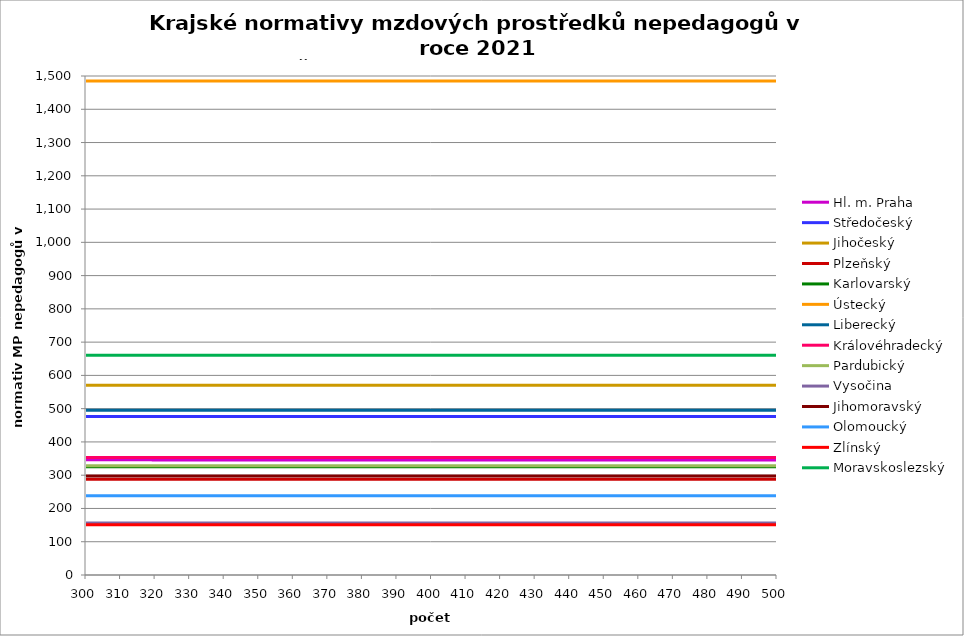
| Category | Hl. m. Praha | Středočeský | Jihočeský | Plzeňský | Karlovarský  | Ústecký   | Liberecký | Královéhradecký | Pardubický | Vysočina | Jihomoravský | Olomoucký | Zlínský | Moravskoslezský |
|---|---|---|---|---|---|---|---|---|---|---|---|---|---|---|
| 300.0 | 346.09 | 476.411 | 570.336 | 287.547 | 325.5 | 1485.12 | 495 | 353.474 | 328.432 | 156.391 | 297.28 | 238.483 | 151.2 | 660.577 |
| 301.0 | 346.09 | 476.411 | 570.336 | 287.547 | 325.5 | 1485.12 | 495 | 353.474 | 328.432 | 156.391 | 297.28 | 238.483 | 151.2 | 660.577 |
| 302.0 | 346.09 | 476.411 | 570.336 | 287.547 | 325.5 | 1485.12 | 495 | 353.474 | 328.432 | 156.391 | 297.28 | 238.483 | 151.2 | 660.577 |
| 303.0 | 346.09 | 476.411 | 570.336 | 287.547 | 325.5 | 1485.12 | 495 | 353.474 | 328.432 | 156.391 | 297.28 | 238.483 | 151.2 | 660.577 |
| 304.0 | 346.085 | 476.411 | 570.336 | 287.547 | 325.5 | 1485.12 | 495 | 353.474 | 328.432 | 156.391 | 297.28 | 238.483 | 151.2 | 660.577 |
| 305.0 | 346.085 | 476.411 | 570.336 | 287.547 | 325.5 | 1485.12 | 495 | 353.474 | 328.432 | 156.391 | 297.28 | 238.483 | 151.2 | 660.577 |
| 306.0 | 346.085 | 476.411 | 570.336 | 287.547 | 325.5 | 1485.12 | 495 | 353.474 | 328.432 | 156.391 | 297.28 | 238.483 | 151.2 | 660.577 |
| 307.0 | 346.085 | 476.411 | 570.336 | 287.547 | 325.5 | 1485.12 | 495 | 353.474 | 328.432 | 156.391 | 297.28 | 238.483 | 151.2 | 660.577 |
| 308.0 | 346.081 | 476.411 | 570.336 | 287.547 | 325.5 | 1485.12 | 495 | 353.474 | 328.432 | 156.391 | 297.28 | 238.483 | 151.2 | 660.577 |
| 309.0 | 346.081 | 476.411 | 570.336 | 287.547 | 325.5 | 1485.12 | 495 | 353.474 | 328.432 | 156.391 | 297.28 | 238.483 | 151.2 | 660.577 |
| 310.0 | 346.081 | 476.411 | 570.336 | 287.547 | 325.5 | 1485.12 | 495 | 353.474 | 328.432 | 156.391 | 297.28 | 238.483 | 151.2 | 660.577 |
| 311.0 | 346.076 | 476.411 | 570.336 | 287.547 | 325.5 | 1485.12 | 495 | 353.474 | 328.432 | 156.391 | 297.28 | 238.483 | 151.2 | 660.577 |
| 312.0 | 346.076 | 476.411 | 570.336 | 287.547 | 325.5 | 1485.12 | 495 | 353.474 | 328.432 | 156.391 | 297.28 | 238.483 | 151.2 | 660.577 |
| 313.0 | 346.076 | 476.411 | 570.336 | 287.547 | 325.5 | 1485.12 | 495 | 353.474 | 328.432 | 156.391 | 297.28 | 238.483 | 151.2 | 660.577 |
| 314.0 | 346.076 | 476.411 | 570.336 | 287.547 | 325.5 | 1485.12 | 495 | 353.474 | 328.432 | 156.391 | 297.28 | 238.483 | 151.2 | 660.577 |
| 315.0 | 346.071 | 476.411 | 570.336 | 287.547 | 325.5 | 1485.12 | 495 | 353.474 | 328.432 | 156.391 | 297.28 | 238.483 | 151.2 | 660.577 |
| 316.0 | 346.071 | 476.411 | 570.336 | 287.547 | 325.5 | 1485.12 | 495 | 353.474 | 328.432 | 156.391 | 297.28 | 238.483 | 151.2 | 660.577 |
| 317.0 | 346.071 | 476.411 | 570.336 | 287.547 | 325.5 | 1485.12 | 495 | 353.474 | 328.432 | 156.391 | 297.28 | 238.483 | 151.2 | 660.577 |
| 318.0 | 346.071 | 476.411 | 570.336 | 287.547 | 325.5 | 1485.12 | 495 | 353.474 | 328.432 | 156.391 | 297.28 | 238.483 | 151.2 | 660.577 |
| 319.0 | 346.066 | 476.411 | 570.336 | 287.547 | 325.5 | 1485.12 | 495 | 353.474 | 328.432 | 156.391 | 297.28 | 238.483 | 151.2 | 660.577 |
| 320.0 | 346.066 | 476.411 | 570.336 | 287.547 | 325.5 | 1485.12 | 495 | 353.474 | 328.432 | 156.391 | 297.28 | 238.483 | 151.2 | 660.577 |
| 321.0 | 346.066 | 476.411 | 570.336 | 287.547 | 325.5 | 1485.12 | 495 | 353.474 | 328.432 | 156.391 | 297.28 | 238.483 | 151.2 | 660.577 |
| 322.0 | 346.066 | 476.411 | 570.336 | 287.547 | 325.5 | 1485.12 | 495 | 353.474 | 328.432 | 156.391 | 297.28 | 238.483 | 151.2 | 660.577 |
| 323.0 | 346.061 | 476.411 | 570.336 | 287.547 | 325.5 | 1485.12 | 495 | 353.474 | 328.432 | 156.391 | 297.28 | 238.483 | 151.2 | 660.577 |
| 324.0 | 346.061 | 476.411 | 570.336 | 287.547 | 325.5 | 1485.12 | 495 | 353.474 | 328.432 | 156.391 | 297.28 | 238.483 | 151.2 | 660.577 |
| 325.0 | 346.061 | 476.411 | 570.336 | 287.547 | 325.5 | 1485.12 | 495 | 353.474 | 328.432 | 156.391 | 297.28 | 238.483 | 151.2 | 660.577 |
| 326.0 | 346.061 | 476.411 | 570.336 | 287.547 | 325.5 | 1485.12 | 495 | 353.474 | 328.432 | 156.391 | 297.28 | 238.483 | 151.2 | 660.577 |
| 327.0 | 346.056 | 476.411 | 570.336 | 287.547 | 325.5 | 1485.12 | 495 | 353.474 | 328.432 | 156.391 | 297.28 | 238.483 | 151.2 | 660.577 |
| 328.0 | 346.056 | 476.411 | 570.336 | 287.547 | 325.5 | 1485.12 | 495 | 353.474 | 328.432 | 156.391 | 297.28 | 238.483 | 151.2 | 660.577 |
| 329.0 | 346.056 | 476.411 | 570.336 | 287.547 | 325.5 | 1485.12 | 495 | 353.474 | 328.432 | 156.391 | 297.28 | 238.483 | 151.2 | 660.577 |
| 330.0 | 346.056 | 476.411 | 570.336 | 287.547 | 325.5 | 1485.12 | 495 | 353.474 | 328.432 | 156.391 | 297.28 | 238.483 | 151.2 | 660.577 |
| 331.0 | 346.051 | 476.411 | 570.336 | 287.547 | 325.5 | 1485.12 | 495 | 353.474 | 328.432 | 156.391 | 297.28 | 238.483 | 151.2 | 660.577 |
| 332.0 | 346.051 | 476.411 | 570.336 | 287.547 | 325.5 | 1485.12 | 495 | 353.474 | 328.432 | 156.391 | 297.28 | 238.483 | 151.2 | 660.577 |
| 333.0 | 346.051 | 476.411 | 570.336 | 287.547 | 325.5 | 1485.12 | 495 | 353.474 | 328.432 | 156.391 | 297.28 | 238.483 | 151.2 | 660.577 |
| 334.0 | 346.051 | 476.411 | 570.336 | 287.547 | 325.5 | 1485.12 | 495 | 353.474 | 328.432 | 156.391 | 297.28 | 238.483 | 151.2 | 660.577 |
| 335.0 | 346.046 | 476.411 | 570.336 | 287.547 | 325.5 | 1485.12 | 495 | 353.474 | 328.432 | 156.391 | 297.28 | 238.483 | 151.2 | 660.577 |
| 336.0 | 346.046 | 476.411 | 570.336 | 287.547 | 325.5 | 1485.12 | 495 | 353.474 | 328.432 | 156.391 | 297.28 | 238.483 | 151.2 | 660.577 |
| 337.0 | 346.046 | 476.411 | 570.336 | 287.547 | 325.5 | 1485.12 | 495 | 353.474 | 328.432 | 156.391 | 297.28 | 238.483 | 151.2 | 660.577 |
| 338.0 | 346.046 | 476.411 | 570.336 | 287.547 | 325.5 | 1485.12 | 495 | 353.474 | 328.432 | 156.391 | 297.28 | 238.483 | 151.2 | 660.577 |
| 339.0 | 346.041 | 476.411 | 570.336 | 287.547 | 325.5 | 1485.12 | 495 | 353.474 | 328.432 | 156.391 | 297.28 | 238.483 | 151.2 | 660.577 |
| 340.0 | 346.041 | 476.411 | 570.336 | 287.547 | 325.5 | 1485.12 | 495 | 353.474 | 328.432 | 156.391 | 297.28 | 238.483 | 151.2 | 660.577 |
| 341.0 | 346.041 | 476.411 | 570.336 | 287.547 | 325.5 | 1485.12 | 495 | 353.474 | 328.432 | 156.391 | 297.28 | 238.483 | 151.2 | 660.577 |
| 342.0 | 346.041 | 476.411 | 570.336 | 287.547 | 325.5 | 1485.12 | 495 | 353.474 | 328.432 | 156.391 | 297.28 | 238.483 | 151.2 | 660.577 |
| 343.0 | 346.037 | 476.411 | 570.336 | 287.547 | 325.5 | 1485.12 | 495 | 353.474 | 328.432 | 156.391 | 297.28 | 238.483 | 151.2 | 660.577 |
| 344.0 | 346.037 | 476.411 | 570.336 | 287.547 | 325.5 | 1485.12 | 495 | 353.474 | 328.432 | 156.391 | 297.28 | 238.483 | 151.2 | 660.577 |
| 345.0 | 346.037 | 476.411 | 570.336 | 287.547 | 325.5 | 1485.12 | 495 | 353.474 | 328.432 | 156.391 | 297.28 | 238.483 | 151.2 | 660.577 |
| 346.0 | 346.037 | 476.411 | 570.336 | 287.547 | 325.5 | 1485.12 | 495 | 353.474 | 328.432 | 156.391 | 297.28 | 238.483 | 151.2 | 660.577 |
| 347.0 | 346.032 | 476.411 | 570.336 | 287.547 | 325.5 | 1485.12 | 495 | 353.474 | 328.432 | 156.391 | 297.28 | 238.483 | 151.2 | 660.577 |
| 348.0 | 346.032 | 476.411 | 570.336 | 287.547 | 325.5 | 1485.12 | 495 | 353.474 | 328.432 | 156.391 | 297.28 | 238.483 | 151.2 | 660.577 |
| 349.0 | 346.032 | 476.411 | 570.336 | 287.547 | 325.5 | 1485.12 | 495 | 353.474 | 328.432 | 156.391 | 297.28 | 238.483 | 151.2 | 660.577 |
| 350.0 | 346.032 | 476.411 | 570.336 | 287.547 | 325.5 | 1485.12 | 495 | 353.474 | 328.432 | 156.391 | 297.28 | 238.483 | 151.2 | 660.577 |
| 351.0 | 346.027 | 476.411 | 570.336 | 287.547 | 325.5 | 1485.12 | 495 | 353.474 | 328.432 | 156.391 | 297.28 | 238.483 | 151.2 | 660.577 |
| 352.0 | 346.027 | 476.411 | 570.336 | 287.547 | 325.5 | 1485.12 | 495 | 353.474 | 328.432 | 156.391 | 297.28 | 238.483 | 151.2 | 660.577 |
| 353.0 | 346.027 | 476.411 | 570.336 | 287.547 | 325.5 | 1485.12 | 495 | 353.474 | 328.432 | 156.391 | 297.28 | 238.483 | 151.2 | 660.577 |
| 354.0 | 346.027 | 476.411 | 570.336 | 287.547 | 325.5 | 1485.12 | 495 | 353.474 | 328.432 | 156.391 | 297.28 | 238.483 | 151.2 | 660.577 |
| 355.0 | 346.027 | 476.411 | 570.336 | 287.547 | 325.5 | 1485.12 | 495 | 353.474 | 328.432 | 156.391 | 297.28 | 238.483 | 151.2 | 660.577 |
| 356.0 | 346.022 | 476.411 | 570.336 | 287.547 | 325.5 | 1485.12 | 495 | 353.474 | 328.432 | 156.391 | 297.28 | 238.483 | 151.2 | 660.577 |
| 357.0 | 346.022 | 476.411 | 570.336 | 287.547 | 325.5 | 1485.12 | 495 | 353.474 | 328.432 | 156.391 | 297.28 | 238.483 | 151.2 | 660.577 |
| 358.0 | 346.022 | 476.411 | 570.336 | 287.547 | 325.5 | 1485.12 | 495 | 353.474 | 328.432 | 156.391 | 297.28 | 238.483 | 151.2 | 660.577 |
| 359.0 | 346.022 | 476.411 | 570.336 | 287.547 | 325.5 | 1485.12 | 495 | 353.474 | 328.432 | 156.391 | 297.28 | 238.483 | 151.2 | 660.577 |
| 360.0 | 346.017 | 476.411 | 570.336 | 287.547 | 325.5 | 1485.12 | 495 | 353.474 | 328.432 | 156.391 | 297.28 | 238.483 | 151.2 | 660.577 |
| 361.0 | 346.017 | 476.411 | 570.336 | 287.547 | 325.5 | 1485.12 | 495 | 353.474 | 328.432 | 156.391 | 297.28 | 238.483 | 151.2 | 660.577 |
| 362.0 | 346.017 | 476.411 | 570.336 | 287.547 | 325.5 | 1485.12 | 495 | 353.474 | 328.432 | 156.391 | 297.28 | 238.483 | 151.2 | 660.577 |
| 363.0 | 346.017 | 476.411 | 570.336 | 287.547 | 325.5 | 1485.12 | 495 | 353.474 | 328.432 | 156.391 | 297.28 | 238.483 | 151.2 | 660.577 |
| 364.0 | 346.012 | 476.411 | 570.336 | 287.547 | 325.5 | 1485.12 | 495 | 353.474 | 328.432 | 156.391 | 297.28 | 238.483 | 151.2 | 660.577 |
| 365.0 | 346.012 | 476.411 | 570.336 | 287.547 | 325.5 | 1485.12 | 495 | 353.474 | 328.432 | 156.391 | 297.28 | 238.483 | 151.2 | 660.577 |
| 366.0 | 346.012 | 476.411 | 570.336 | 287.547 | 325.5 | 1485.12 | 495 | 353.474 | 328.432 | 156.391 | 297.28 | 238.483 | 151.2 | 660.577 |
| 367.0 | 346.012 | 476.411 | 570.336 | 287.547 | 325.5 | 1485.12 | 495 | 353.474 | 328.432 | 156.391 | 297.28 | 238.483 | 151.2 | 660.577 |
| 368.0 | 346.012 | 476.411 | 570.336 | 287.547 | 325.5 | 1485.12 | 495 | 353.474 | 328.432 | 156.391 | 297.28 | 238.483 | 151.2 | 660.577 |
| 369.0 | 346.007 | 476.411 | 570.336 | 287.547 | 325.5 | 1485.12 | 495 | 353.474 | 328.432 | 156.391 | 297.28 | 238.483 | 151.2 | 660.577 |
| 370.0 | 346.007 | 476.411 | 570.336 | 287.547 | 325.5 | 1485.12 | 495 | 353.474 | 328.432 | 156.391 | 297.28 | 238.483 | 151.2 | 660.577 |
| 371.0 | 346.007 | 476.411 | 570.336 | 287.547 | 325.5 | 1485.12 | 495 | 353.474 | 328.432 | 156.391 | 297.28 | 238.483 | 151.2 | 660.577 |
| 372.0 | 346.007 | 476.411 | 570.336 | 287.547 | 325.5 | 1485.12 | 495 | 353.474 | 328.432 | 156.391 | 297.28 | 238.483 | 151.2 | 660.577 |
| 373.0 | 346.002 | 476.411 | 570.336 | 287.547 | 325.5 | 1485.12 | 495 | 353.474 | 328.432 | 156.391 | 297.28 | 238.483 | 151.2 | 660.577 |
| 374.0 | 346.002 | 476.411 | 570.336 | 287.547 | 325.5 | 1485.12 | 495 | 353.474 | 328.432 | 156.391 | 297.28 | 238.483 | 151.2 | 660.577 |
| 375.0 | 346.002 | 476.411 | 570.336 | 287.547 | 325.5 | 1485.12 | 495 | 353.474 | 328.432 | 156.391 | 297.28 | 238.483 | 151.2 | 660.577 |
| 376.0 | 346.002 | 476.411 | 570.336 | 287.547 | 325.5 | 1485.12 | 495 | 353.474 | 328.432 | 156.391 | 297.28 | 238.483 | 151.2 | 660.577 |
| 377.0 | 346.002 | 476.411 | 570.336 | 287.547 | 325.5 | 1485.12 | 495 | 353.474 | 328.432 | 156.391 | 297.28 | 238.483 | 151.2 | 660.577 |
| 378.0 | 345.998 | 476.411 | 570.336 | 287.547 | 325.5 | 1485.12 | 495 | 353.474 | 328.432 | 156.391 | 297.28 | 238.483 | 151.2 | 660.577 |
| 379.0 | 345.998 | 476.411 | 570.336 | 287.547 | 325.5 | 1485.12 | 495 | 353.474 | 328.432 | 156.391 | 297.28 | 238.483 | 151.2 | 660.577 |
| 380.0 | 345.998 | 476.411 | 570.336 | 287.547 | 325.5 | 1485.12 | 495 | 353.474 | 328.432 | 156.391 | 297.28 | 238.483 | 151.2 | 660.577 |
| 381.0 | 345.998 | 476.411 | 570.336 | 287.547 | 325.5 | 1485.12 | 495 | 353.474 | 328.432 | 156.391 | 297.28 | 238.483 | 151.2 | 660.577 |
| 382.0 | 345.998 | 476.411 | 570.336 | 287.547 | 325.5 | 1485.12 | 495 | 353.474 | 328.432 | 156.391 | 297.28 | 238.483 | 151.2 | 660.577 |
| 383.0 | 345.993 | 476.411 | 570.336 | 287.547 | 325.5 | 1485.12 | 495 | 353.474 | 328.432 | 156.391 | 297.28 | 238.483 | 151.2 | 660.577 |
| 384.0 | 345.993 | 476.411 | 570.336 | 287.547 | 325.5 | 1485.12 | 495 | 353.474 | 328.432 | 156.391 | 297.28 | 238.483 | 151.2 | 660.577 |
| 385.0 | 345.993 | 476.411 | 570.336 | 287.547 | 325.5 | 1485.12 | 495 | 353.474 | 328.432 | 156.391 | 297.28 | 238.483 | 151.2 | 660.577 |
| 386.0 | 345.993 | 476.411 | 570.336 | 287.547 | 325.5 | 1485.12 | 495 | 353.474 | 328.432 | 156.391 | 297.28 | 238.483 | 151.2 | 660.577 |
| 387.0 | 345.988 | 476.411 | 570.336 | 287.547 | 325.5 | 1485.12 | 495 | 353.474 | 328.432 | 156.391 | 297.28 | 238.483 | 151.2 | 660.577 |
| 388.0 | 345.988 | 476.411 | 570.336 | 287.547 | 325.5 | 1485.12 | 495 | 353.474 | 328.432 | 156.391 | 297.28 | 238.483 | 151.2 | 660.577 |
| 389.0 | 345.988 | 476.411 | 570.336 | 287.547 | 325.5 | 1485.12 | 495 | 353.474 | 328.432 | 156.391 | 297.28 | 238.483 | 151.2 | 660.577 |
| 390.0 | 345.988 | 476.411 | 570.336 | 287.547 | 325.5 | 1485.12 | 495 | 353.474 | 328.432 | 156.391 | 297.28 | 238.483 | 151.2 | 660.577 |
| 391.0 | 345.988 | 476.411 | 570.336 | 287.547 | 325.5 | 1485.12 | 495 | 353.474 | 328.432 | 156.391 | 297.28 | 238.483 | 151.2 | 660.577 |
| 392.0 | 345.983 | 476.411 | 570.336 | 287.547 | 325.5 | 1485.12 | 495 | 353.474 | 328.432 | 156.391 | 297.28 | 238.483 | 151.2 | 660.577 |
| 393.0 | 345.983 | 476.411 | 570.336 | 287.547 | 325.5 | 1485.12 | 495 | 353.474 | 328.432 | 156.391 | 297.28 | 238.483 | 151.2 | 660.577 |
| 394.0 | 345.983 | 476.411 | 570.336 | 287.547 | 325.5 | 1485.12 | 495 | 353.474 | 328.432 | 156.391 | 297.28 | 238.483 | 151.2 | 660.577 |
| 395.0 | 345.983 | 476.411 | 570.336 | 287.547 | 325.5 | 1485.12 | 495 | 353.474 | 328.432 | 156.391 | 297.28 | 238.483 | 151.2 | 660.577 |
| 396.0 | 345.983 | 476.411 | 570.336 | 287.547 | 325.5 | 1485.12 | 495 | 353.474 | 328.432 | 156.391 | 297.28 | 238.483 | 151.2 | 660.577 |
| 397.0 | 345.978 | 476.411 | 570.336 | 287.547 | 325.5 | 1485.12 | 495 | 353.474 | 328.432 | 156.391 | 297.28 | 238.483 | 151.2 | 660.577 |
| 398.0 | 345.978 | 476.411 | 570.336 | 287.547 | 325.5 | 1485.12 | 495 | 353.474 | 328.432 | 156.391 | 297.28 | 238.483 | 151.2 | 660.577 |
| 399.0 | 345.978 | 476.411 | 570.336 | 287.547 | 325.5 | 1485.12 | 495 | 353.474 | 328.432 | 156.391 | 297.28 | 238.483 | 151.2 | 660.577 |
| 400.0 | 345.978 | 476.411 | 570.336 | 287.547 | 325.5 | 1485.12 | 495 | 353.474 | 328.432 | 156.391 | 297.28 | 238.483 | 151.2 | 660.577 |
| 401.0 | 345.978 | 476.411 | 570.336 | 287.547 | 325.5 | 1485.12 | 495 | 353.474 | 328.432 | 156.391 | 297.28 | 238.483 | 151.2 | 660.577 |
| 402.0 | 345.973 | 476.411 | 570.336 | 287.547 | 325.5 | 1485.12 | 495 | 353.474 | 328.432 | 156.391 | 297.28 | 238.483 | 151.2 | 660.577 |
| 403.0 | 345.973 | 476.411 | 570.336 | 287.547 | 325.5 | 1485.12 | 495 | 353.474 | 328.432 | 156.391 | 297.28 | 238.483 | 151.2 | 660.577 |
| 404.0 | 345.973 | 476.411 | 570.336 | 287.547 | 325.5 | 1485.12 | 495 | 353.474 | 328.432 | 156.391 | 297.28 | 238.483 | 151.2 | 660.577 |
| 405.0 | 345.973 | 476.411 | 570.336 | 287.547 | 325.5 | 1485.12 | 495 | 353.474 | 328.432 | 156.391 | 297.28 | 238.483 | 151.2 | 660.577 |
| 406.0 | 345.968 | 476.411 | 570.336 | 287.547 | 325.5 | 1485.12 | 495 | 353.474 | 328.432 | 156.391 | 297.28 | 238.483 | 151.2 | 660.577 |
| 407.0 | 345.968 | 476.411 | 570.336 | 287.547 | 325.5 | 1485.12 | 495 | 353.474 | 328.432 | 156.391 | 297.28 | 238.483 | 151.2 | 660.577 |
| 408.0 | 345.968 | 476.411 | 570.336 | 287.547 | 325.5 | 1485.12 | 495 | 353.474 | 328.432 | 156.391 | 297.28 | 238.483 | 151.2 | 660.577 |
| 409.0 | 345.968 | 476.411 | 570.336 | 287.547 | 325.5 | 1485.12 | 495 | 353.474 | 328.432 | 156.391 | 297.28 | 238.483 | 151.2 | 660.577 |
| 410.0 | 345.968 | 476.411 | 570.336 | 287.547 | 325.5 | 1485.12 | 495 | 353.474 | 328.432 | 156.391 | 297.28 | 238.483 | 151.2 | 660.577 |
| 411.0 | 345.963 | 476.411 | 570.336 | 287.547 | 325.5 | 1485.12 | 495 | 353.474 | 328.432 | 156.391 | 297.28 | 238.483 | 151.2 | 660.577 |
| 412.0 | 345.963 | 476.411 | 570.336 | 287.547 | 325.5 | 1485.12 | 495 | 353.474 | 328.432 | 156.391 | 297.28 | 238.483 | 151.2 | 660.577 |
| 413.0 | 345.963 | 476.411 | 570.336 | 287.547 | 325.5 | 1485.12 | 495 | 353.474 | 328.432 | 156.391 | 297.28 | 238.483 | 151.2 | 660.577 |
| 414.0 | 345.963 | 476.411 | 570.336 | 287.547 | 325.5 | 1485.12 | 495 | 353.474 | 328.432 | 156.391 | 297.28 | 238.483 | 151.2 | 660.577 |
| 415.0 | 345.963 | 476.411 | 570.336 | 287.547 | 325.5 | 1485.12 | 495 | 353.474 | 328.432 | 156.391 | 297.28 | 238.483 | 151.2 | 660.577 |
| 416.0 | 345.958 | 476.411 | 570.336 | 287.547 | 325.5 | 1485.12 | 495 | 353.474 | 328.432 | 156.391 | 297.28 | 238.483 | 151.2 | 660.577 |
| 417.0 | 345.958 | 476.411 | 570.336 | 287.547 | 325.5 | 1485.12 | 495 | 353.474 | 328.432 | 156.391 | 297.28 | 238.483 | 151.2 | 660.577 |
| 418.0 | 345.958 | 476.411 | 570.336 | 287.547 | 325.5 | 1485.12 | 495 | 353.474 | 328.432 | 156.391 | 297.28 | 238.483 | 151.2 | 660.577 |
| 419.0 | 345.958 | 476.411 | 570.336 | 287.547 | 325.5 | 1485.12 | 495 | 353.474 | 328.432 | 156.391 | 297.28 | 238.483 | 151.2 | 660.577 |
| 420.0 | 345.958 | 476.411 | 570.336 | 287.547 | 325.5 | 1485.12 | 495 | 353.474 | 328.432 | 156.391 | 297.28 | 238.483 | 151.2 | 660.577 |
| 421.0 | 345.958 | 476.411 | 570.336 | 287.547 | 325.5 | 1485.12 | 495 | 353.474 | 328.432 | 156.391 | 297.28 | 238.483 | 151.2 | 660.577 |
| 422.0 | 345.954 | 476.411 | 570.336 | 287.547 | 325.5 | 1485.12 | 495 | 353.474 | 328.432 | 156.391 | 297.28 | 238.483 | 151.2 | 660.577 |
| 423.0 | 345.954 | 476.411 | 570.336 | 287.547 | 325.5 | 1485.12 | 495 | 353.474 | 328.432 | 156.391 | 297.28 | 238.483 | 151.2 | 660.577 |
| 424.0 | 345.954 | 476.411 | 570.336 | 287.547 | 325.5 | 1485.12 | 495 | 353.474 | 328.432 | 156.391 | 297.28 | 238.483 | 151.2 | 660.577 |
| 425.0 | 345.954 | 476.411 | 570.336 | 287.547 | 325.5 | 1485.12 | 495 | 353.474 | 328.432 | 156.391 | 297.28 | 238.483 | 151.2 | 660.577 |
| 426.0 | 345.954 | 476.411 | 570.336 | 287.547 | 325.5 | 1485.12 | 495 | 353.474 | 328.432 | 156.391 | 297.28 | 238.483 | 151.2 | 660.577 |
| 427.0 | 345.949 | 476.411 | 570.336 | 287.547 | 325.5 | 1485.12 | 495 | 353.474 | 328.432 | 156.391 | 297.28 | 238.483 | 151.2 | 660.577 |
| 428.0 | 345.949 | 476.411 | 570.336 | 287.547 | 325.5 | 1485.12 | 495 | 353.474 | 328.432 | 156.391 | 297.28 | 238.483 | 151.2 | 660.577 |
| 429.0 | 345.949 | 476.411 | 570.336 | 287.547 | 325.5 | 1485.12 | 495 | 353.474 | 328.432 | 156.391 | 297.28 | 238.483 | 151.2 | 660.577 |
| 430.0 | 345.949 | 476.411 | 570.336 | 287.547 | 325.5 | 1485.12 | 495 | 353.474 | 328.432 | 156.391 | 297.28 | 238.483 | 151.2 | 660.577 |
| 431.0 | 345.949 | 476.411 | 570.336 | 287.547 | 325.5 | 1485.12 | 495 | 353.474 | 328.432 | 156.391 | 297.28 | 238.483 | 151.2 | 660.577 |
| 432.0 | 345.944 | 476.411 | 570.336 | 287.547 | 325.5 | 1485.12 | 495 | 353.474 | 328.432 | 156.391 | 297.28 | 238.483 | 151.2 | 660.577 |
| 433.0 | 345.944 | 476.411 | 570.336 | 287.547 | 325.5 | 1485.12 | 495 | 353.474 | 328.432 | 156.391 | 297.28 | 238.483 | 151.2 | 660.577 |
| 434.0 | 345.944 | 476.411 | 570.336 | 287.547 | 325.5 | 1485.12 | 495 | 353.474 | 328.432 | 156.391 | 297.28 | 238.483 | 151.2 | 660.577 |
| 435.0 | 345.944 | 476.411 | 570.336 | 287.547 | 325.5 | 1485.12 | 495 | 353.474 | 328.432 | 156.391 | 297.28 | 238.483 | 151.2 | 660.577 |
| 436.0 | 345.944 | 476.411 | 570.336 | 287.547 | 325.5 | 1485.12 | 495 | 353.474 | 328.432 | 156.391 | 297.28 | 238.483 | 151.2 | 660.577 |
| 437.0 | 345.939 | 476.411 | 570.336 | 287.547 | 325.5 | 1485.12 | 495 | 353.474 | 328.432 | 156.391 | 297.28 | 238.483 | 151.2 | 660.577 |
| 438.0 | 345.939 | 476.411 | 570.336 | 287.547 | 325.5 | 1485.12 | 495 | 353.474 | 328.432 | 156.391 | 297.28 | 238.483 | 151.2 | 660.577 |
| 439.0 | 345.939 | 476.411 | 570.336 | 287.547 | 325.5 | 1485.12 | 495 | 353.474 | 328.432 | 156.391 | 297.28 | 238.483 | 151.2 | 660.577 |
| 440.0 | 345.939 | 476.411 | 570.336 | 287.547 | 325.5 | 1485.12 | 495 | 353.474 | 328.432 | 156.391 | 297.28 | 238.483 | 151.2 | 660.577 |
| 441.0 | 345.939 | 476.411 | 570.336 | 287.547 | 325.5 | 1485.12 | 495 | 353.474 | 328.432 | 156.391 | 297.28 | 238.483 | 151.2 | 660.577 |
| 442.0 | 345.939 | 476.411 | 570.336 | 287.547 | 325.5 | 1485.12 | 495 | 353.474 | 328.432 | 156.391 | 297.28 | 238.483 | 151.2 | 660.577 |
| 443.0 | 345.934 | 476.411 | 570.336 | 287.547 | 325.5 | 1485.12 | 495 | 353.474 | 328.432 | 156.391 | 297.28 | 238.483 | 151.2 | 660.577 |
| 444.0 | 345.934 | 476.411 | 570.336 | 287.547 | 325.5 | 1485.12 | 495 | 353.474 | 328.432 | 156.391 | 297.28 | 238.483 | 151.2 | 660.577 |
| 445.0 | 345.934 | 476.411 | 570.336 | 287.547 | 325.5 | 1485.12 | 495 | 353.474 | 328.432 | 156.391 | 297.28 | 238.483 | 151.2 | 660.577 |
| 446.0 | 345.934 | 476.411 | 570.336 | 287.547 | 325.5 | 1485.12 | 495 | 353.474 | 328.432 | 156.391 | 297.28 | 238.483 | 151.2 | 660.577 |
| 447.0 | 345.934 | 476.411 | 570.336 | 287.547 | 325.5 | 1485.12 | 495 | 353.474 | 328.432 | 156.391 | 297.28 | 238.483 | 151.2 | 660.577 |
| 448.0 | 345.929 | 476.411 | 570.336 | 287.547 | 325.5 | 1485.12 | 495 | 353.474 | 328.432 | 156.391 | 297.28 | 238.483 | 151.2 | 660.577 |
| 449.0 | 345.929 | 476.411 | 570.336 | 287.547 | 325.5 | 1485.12 | 495 | 353.474 | 328.432 | 156.391 | 297.28 | 238.483 | 151.2 | 660.577 |
| 450.0 | 345.929 | 476.411 | 570.336 | 287.547 | 325.5 | 1485.12 | 495 | 353.474 | 328.432 | 156.391 | 297.28 | 238.483 | 151.2 | 660.577 |
| 451.0 | 345.929 | 476.411 | 570.336 | 287.547 | 325.5 | 1485.12 | 495 | 353.474 | 328.432 | 156.391 | 297.28 | 238.483 | 151.2 | 660.577 |
| 452.0 | 345.929 | 476.411 | 570.336 | 287.547 | 325.5 | 1485.12 | 495 | 353.474 | 328.432 | 156.391 | 297.28 | 238.483 | 151.2 | 660.577 |
| 453.0 | 345.924 | 476.411 | 570.336 | 287.547 | 325.5 | 1485.12 | 495 | 353.474 | 328.432 | 156.391 | 297.28 | 238.483 | 151.2 | 660.577 |
| 454.0 | 345.924 | 476.411 | 570.336 | 287.547 | 325.5 | 1485.12 | 495 | 353.474 | 328.432 | 156.391 | 297.28 | 238.483 | 151.2 | 660.577 |
| 455.0 | 345.924 | 476.411 | 570.336 | 287.547 | 325.5 | 1485.12 | 495 | 353.474 | 328.432 | 156.391 | 297.28 | 238.483 | 151.2 | 660.577 |
| 456.0 | 345.924 | 476.411 | 570.336 | 287.547 | 325.5 | 1485.12 | 495 | 353.474 | 328.432 | 156.391 | 297.28 | 238.483 | 151.2 | 660.577 |
| 457.0 | 345.924 | 476.411 | 570.336 | 287.547 | 325.5 | 1485.12 | 495 | 353.474 | 328.432 | 156.391 | 297.28 | 238.483 | 151.2 | 660.577 |
| 458.0 | 345.924 | 476.411 | 570.336 | 287.547 | 325.5 | 1485.12 | 495 | 353.474 | 328.432 | 156.391 | 297.28 | 238.483 | 151.2 | 660.577 |
| 459.0 | 345.919 | 476.411 | 570.336 | 287.547 | 325.5 | 1485.12 | 495 | 353.474 | 328.432 | 156.391 | 297.28 | 238.483 | 151.2 | 660.577 |
| 460.0 | 345.919 | 476.411 | 570.336 | 287.547 | 325.5 | 1485.12 | 495 | 353.474 | 328.432 | 156.391 | 297.28 | 238.483 | 151.2 | 660.577 |
| 461.0 | 345.919 | 476.411 | 570.336 | 287.547 | 325.5 | 1485.12 | 495 | 353.474 | 328.432 | 156.391 | 297.28 | 238.483 | 151.2 | 660.577 |
| 462.0 | 345.919 | 476.411 | 570.336 | 287.547 | 325.5 | 1485.12 | 495 | 353.474 | 328.432 | 156.391 | 297.28 | 238.483 | 151.2 | 660.577 |
| 463.0 | 345.919 | 476.411 | 570.336 | 287.547 | 325.5 | 1485.12 | 495 | 353.474 | 328.432 | 156.391 | 297.28 | 238.483 | 151.2 | 660.577 |
| 464.0 | 345.919 | 476.411 | 570.336 | 287.547 | 325.5 | 1485.12 | 495 | 353.474 | 328.432 | 156.391 | 297.28 | 238.483 | 151.2 | 660.577 |
| 465.0 | 345.915 | 476.411 | 570.336 | 287.547 | 325.5 | 1485.12 | 495 | 353.474 | 328.432 | 156.391 | 297.28 | 238.483 | 151.2 | 660.577 |
| 466.0 | 345.915 | 476.411 | 570.336 | 287.547 | 325.5 | 1485.12 | 495 | 353.474 | 328.432 | 156.391 | 297.28 | 238.483 | 151.2 | 660.577 |
| 467.0 | 345.915 | 476.411 | 570.336 | 287.547 | 325.5 | 1485.12 | 495 | 353.474 | 328.432 | 156.391 | 297.28 | 238.483 | 151.2 | 660.577 |
| 468.0 | 345.915 | 476.411 | 570.336 | 287.547 | 325.5 | 1485.12 | 495 | 353.474 | 328.432 | 156.391 | 297.28 | 238.483 | 151.2 | 660.577 |
| 469.0 | 345.915 | 476.411 | 570.336 | 287.547 | 325.5 | 1485.12 | 495 | 353.474 | 328.432 | 156.391 | 297.28 | 238.483 | 151.2 | 660.577 |
| 470.0 | 345.91 | 476.411 | 570.336 | 287.547 | 325.5 | 1485.12 | 495 | 353.474 | 328.432 | 156.391 | 297.28 | 238.483 | 151.2 | 660.577 |
| 471.0 | 345.91 | 476.411 | 570.336 | 287.547 | 325.5 | 1485.12 | 495 | 353.474 | 328.432 | 156.391 | 297.28 | 238.483 | 151.2 | 660.577 |
| 472.0 | 345.91 | 476.411 | 570.336 | 287.547 | 325.5 | 1485.12 | 495 | 353.474 | 328.432 | 156.391 | 297.28 | 238.483 | 151.2 | 660.577 |
| 473.0 | 345.91 | 476.411 | 570.336 | 287.547 | 325.5 | 1485.12 | 495 | 353.474 | 328.432 | 156.391 | 297.28 | 238.483 | 151.2 | 660.577 |
| 474.0 | 345.91 | 476.411 | 570.336 | 287.547 | 325.5 | 1485.12 | 495 | 353.474 | 328.432 | 156.391 | 297.28 | 238.483 | 151.2 | 660.577 |
| 475.0 | 345.91 | 476.411 | 570.336 | 287.547 | 325.5 | 1485.12 | 495 | 353.474 | 328.432 | 156.391 | 297.28 | 238.483 | 151.2 | 660.577 |
| 476.0 | 345.905 | 476.411 | 570.336 | 287.547 | 325.5 | 1485.12 | 495 | 353.474 | 328.432 | 156.391 | 297.28 | 238.483 | 151.2 | 660.577 |
| 477.0 | 345.905 | 476.411 | 570.336 | 287.547 | 325.5 | 1485.12 | 495 | 353.474 | 328.432 | 156.391 | 297.28 | 238.483 | 151.2 | 660.577 |
| 478.0 | 345.905 | 476.411 | 570.336 | 287.547 | 325.5 | 1485.12 | 495 | 353.474 | 328.432 | 156.391 | 297.28 | 238.483 | 151.2 | 660.577 |
| 479.0 | 345.905 | 476.411 | 570.336 | 287.547 | 325.5 | 1485.12 | 495 | 353.474 | 328.432 | 156.391 | 297.28 | 238.483 | 151.2 | 660.577 |
| 480.0 | 345.905 | 476.411 | 570.336 | 287.547 | 325.5 | 1485.12 | 495 | 353.474 | 328.432 | 156.391 | 297.28 | 238.483 | 151.2 | 660.577 |
| 481.0 | 345.905 | 476.411 | 570.336 | 287.547 | 325.5 | 1485.12 | 495 | 353.474 | 328.432 | 156.391 | 297.28 | 238.483 | 151.2 | 660.577 |
| 482.0 | 345.9 | 476.411 | 570.336 | 287.547 | 325.5 | 1485.12 | 495 | 353.474 | 328.432 | 156.391 | 297.28 | 238.483 | 151.2 | 660.577 |
| 483.0 | 345.9 | 476.411 | 570.336 | 287.547 | 325.5 | 1485.12 | 495 | 353.474 | 328.432 | 156.391 | 297.28 | 238.483 | 151.2 | 660.577 |
| 484.0 | 345.9 | 476.411 | 570.336 | 287.547 | 325.5 | 1485.12 | 495 | 353.474 | 328.432 | 156.391 | 297.28 | 238.483 | 151.2 | 660.577 |
| 485.0 | 345.9 | 476.411 | 570.336 | 287.547 | 325.5 | 1485.12 | 495 | 353.474 | 328.432 | 156.391 | 297.28 | 238.483 | 151.2 | 660.577 |
| 486.0 | 345.9 | 476.411 | 570.336 | 287.547 | 325.5 | 1485.12 | 495 | 353.474 | 328.432 | 156.391 | 297.28 | 238.483 | 151.2 | 660.577 |
| 487.0 | 345.9 | 476.411 | 570.336 | 287.547 | 325.5 | 1485.12 | 495 | 353.474 | 328.432 | 156.391 | 297.28 | 238.483 | 151.2 | 660.577 |
| 488.0 | 345.895 | 476.411 | 570.336 | 287.547 | 325.5 | 1485.12 | 495 | 353.474 | 328.432 | 156.391 | 297.28 | 238.483 | 151.2 | 660.577 |
| 489.0 | 345.895 | 476.411 | 570.336 | 287.547 | 325.5 | 1485.12 | 495 | 353.474 | 328.432 | 156.391 | 297.28 | 238.483 | 151.2 | 660.577 |
| 490.0 | 345.895 | 476.411 | 570.336 | 287.547 | 325.5 | 1485.12 | 495 | 353.474 | 328.432 | 156.391 | 297.28 | 238.483 | 151.2 | 660.577 |
| 491.0 | 345.895 | 476.411 | 570.336 | 287.547 | 325.5 | 1485.12 | 495 | 353.474 | 328.432 | 156.391 | 297.28 | 238.483 | 151.2 | 660.577 |
| 492.0 | 345.895 | 476.411 | 570.336 | 287.547 | 325.5 | 1485.12 | 495 | 353.474 | 328.432 | 156.391 | 297.28 | 238.483 | 151.2 | 660.577 |
| 493.0 | 345.895 | 476.411 | 570.336 | 287.547 | 325.5 | 1485.12 | 495 | 353.474 | 328.432 | 156.391 | 297.28 | 238.483 | 151.2 | 660.577 |
| 494.0 | 345.89 | 476.411 | 570.336 | 287.547 | 325.5 | 1485.12 | 495 | 353.474 | 328.432 | 156.391 | 297.28 | 238.483 | 151.2 | 660.577 |
| 495.0 | 345.89 | 476.411 | 570.336 | 287.547 | 325.5 | 1485.12 | 495 | 353.474 | 328.432 | 156.391 | 297.28 | 238.483 | 151.2 | 660.577 |
| 496.0 | 345.89 | 476.411 | 570.336 | 287.547 | 325.5 | 1485.12 | 495 | 353.474 | 328.432 | 156.391 | 297.28 | 238.483 | 151.2 | 660.577 |
| 497.0 | 345.89 | 476.411 | 570.336 | 287.547 | 325.5 | 1485.12 | 495 | 353.474 | 328.432 | 156.391 | 297.28 | 238.483 | 151.2 | 660.577 |
| 498.0 | 345.89 | 476.411 | 570.336 | 287.547 | 325.5 | 1485.12 | 495 | 353.474 | 328.432 | 156.391 | 297.28 | 238.483 | 151.2 | 660.577 |
| 499.0 | 345.89 | 476.411 | 570.336 | 287.547 | 325.5 | 1485.12 | 495 | 353.474 | 328.432 | 156.391 | 297.28 | 238.483 | 151.2 | 660.577 |
| 500.0 | 345.885 | 476.411 | 570.336 | 287.547 | 325.5 | 1485.12 | 495 | 353.474 | 328.432 | 156.391 | 297.28 | 238.483 | 151.2 | 660.577 |